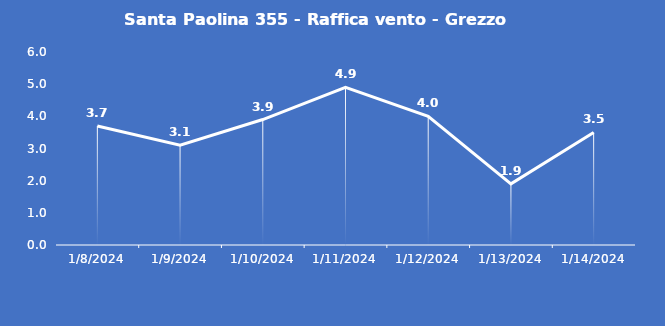
| Category | Santa Paolina 355 - Raffica vento - Grezzo (m/s) |
|---|---|
| 1/8/24 | 3.7 |
| 1/9/24 | 3.1 |
| 1/10/24 | 3.9 |
| 1/11/24 | 4.9 |
| 1/12/24 | 4 |
| 1/13/24 | 1.9 |
| 1/14/24 | 3.5 |